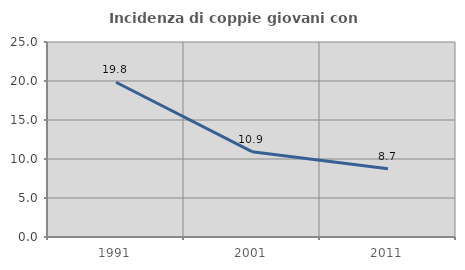
| Category | Incidenza di coppie giovani con figli |
|---|---|
| 1991.0 | 19.838 |
| 2001.0 | 10.938 |
| 2011.0 | 8.745 |